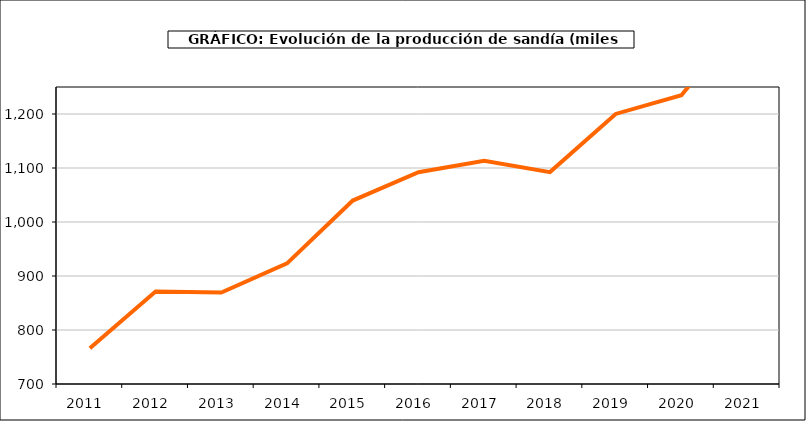
| Category | producción |
|---|---|
| 2011.0 | 766.301 |
| 2012.0 | 871.324 |
| 2013.0 | 869.499 |
| 2014.0 | 923.32 |
| 2015.0 | 1039.698 |
| 2016.0 | 1092.075 |
| 2017.0 | 1113.192 |
| 2018.0 | 1092.401 |
| 2019.0 | 1200.093 |
| 2020.0 | 1234.85 |
| 2021.0 | 1382.278 |